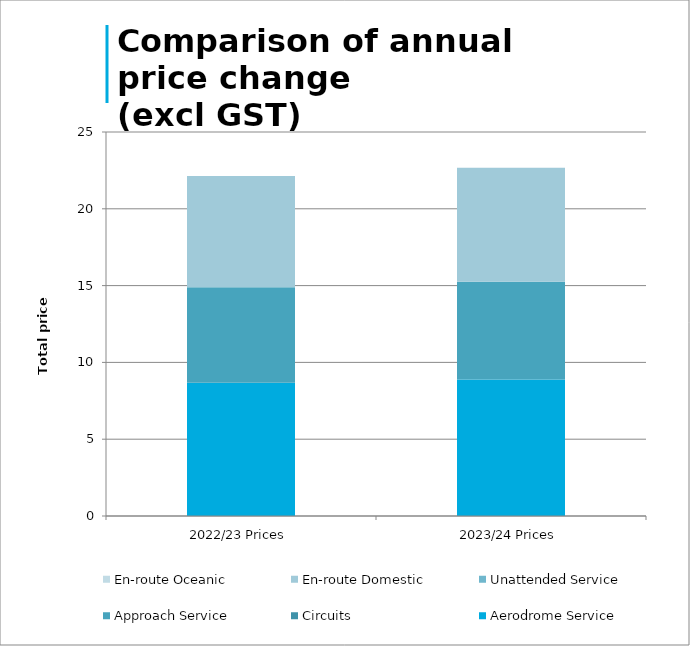
| Category | Aerodrome Service | Circuits | Approach Service | Unattended Service | En-route Domestic | En-route Oceanic |
|---|---|---|---|---|---|---|
| 2022/23 Prices | 8.68 | 0 | 6.21 | 0 | 7.25 | 0 |
| 2023/24 Prices | 8.89 | 0 | 6.36 | 0 | 7.42 | 0 |